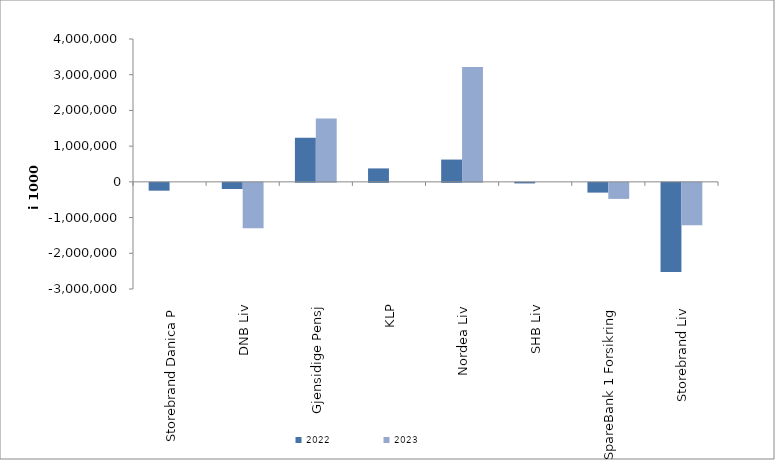
| Category | 2022 | 2023 |
|---|---|---|
| Storebrand Danica P | -219078.763 | 0 |
| DNB Liv | -172405 | -1268947 |
| Gjensidige Pensj | 1232079 | 1771889 |
| KLP | 376440.529 | 0 |
| Nordea Liv | 624143.677 | 3216059.303 |
| SHB Liv | -15435.86 | 0 |
| SpareBank 1 Forsikring | -273107.306 | -449560.403 |
| Storebrand Liv | -2494222.933 | -1184945.568 |